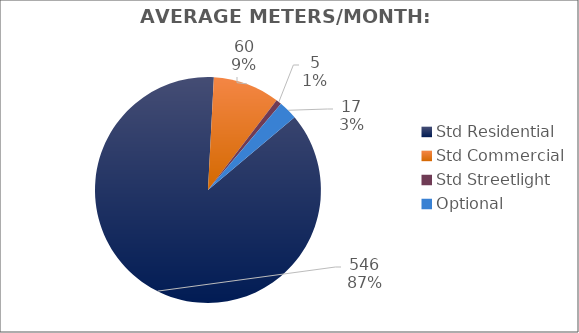
| Category | Meters |
|---|---|
| Std Residential | 546 |
| Std Commercial | 60 |
| Std Streetlight | 5 |
| Optional | 17 |